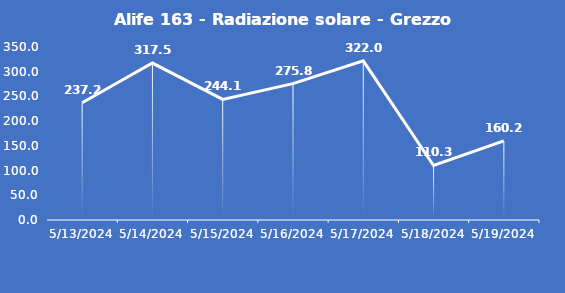
| Category | Alife 163 - Radiazione solare - Grezzo (W/m2) |
|---|---|
| 5/13/24 | 237.2 |
| 5/14/24 | 317.5 |
| 5/15/24 | 244.1 |
| 5/16/24 | 275.8 |
| 5/17/24 | 322 |
| 5/18/24 | 110.3 |
| 5/19/24 | 160.2 |